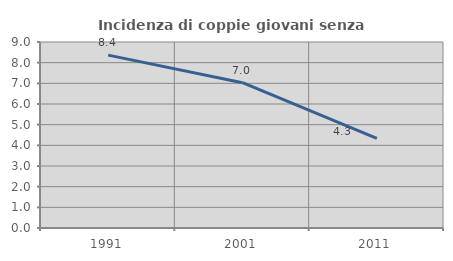
| Category | Incidenza di coppie giovani senza figli |
|---|---|
| 1991.0 | 8.365 |
| 2001.0 | 7.03 |
| 2011.0 | 4.338 |